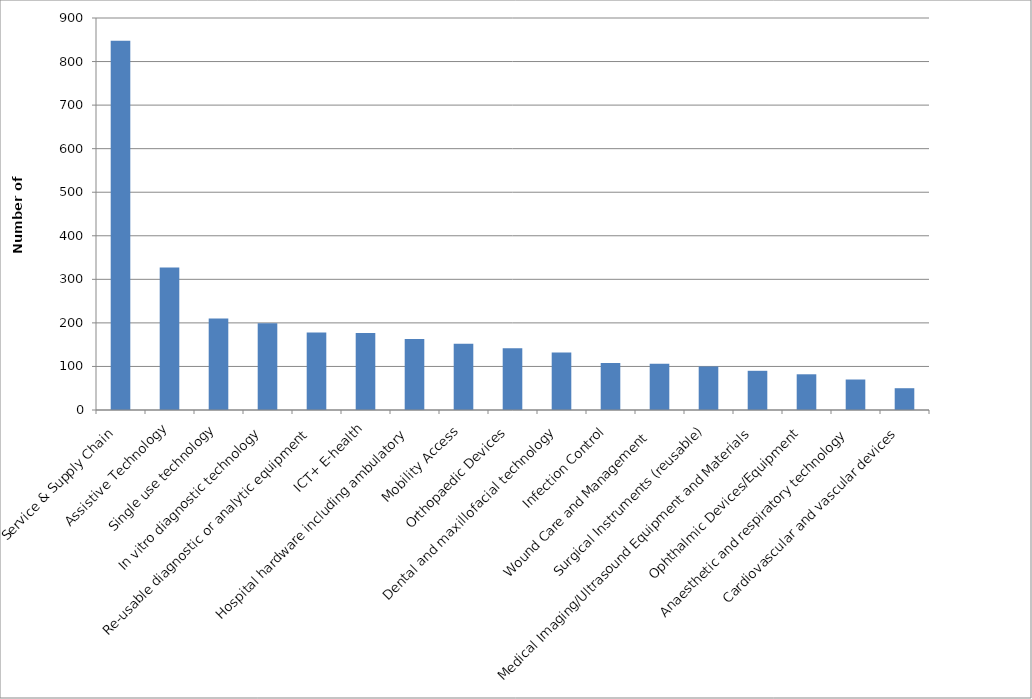
| Category | Series 0 |
|---|---|
| Service & Supply Chain | 848 |
| Assistive Technology | 327 |
| Single use technology | 210 |
| In vitro diagnostic technology | 199 |
| Re-usable diagnostic or analytic equipment | 178 |
| ICT+ E-health | 177 |
| Hospital hardware including ambulatory | 163 |
| Mobility Access | 152 |
| Orthopaedic Devices | 142 |
| Dental and maxillofacial technology | 132 |
| Infection Control  | 108 |
| Wound Care and Management  | 106 |
| Surgical Instruments (reusable) | 100 |
| Medical Imaging/Ultrasound Equipment and Materials | 90 |
| Ophthalmic Devices/Equipment | 82 |
| Anaesthetic and respiratory technology | 70 |
| Cardiovascular and vascular devices | 50 |